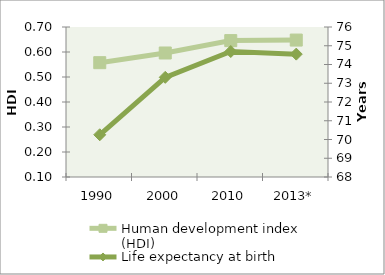
| Category | Human development index (HDI) |
|---|---|
| 1990 | 0.557 |
| 2000 | 0.596 |
| 2010 | 0.646 |
| 2013* | 0.648 |